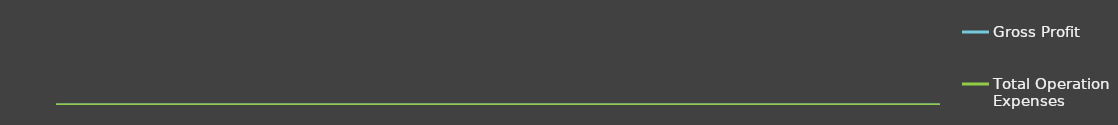
| Category | Gross Profit | Total Operation Expenses |
|---|---|---|
| 0 | 0 | 0 |
| 1 | 0 | 0 |
| 2 | 0 | 0 |
| 3 | 0 | 0 |
| 4 | 0 | 0 |
| 5 | 0 | 0 |
| 6 | 0 | 0 |
| 7 | 0 | 0 |
| 8 | 0 | 0 |
| 9 | 0 | 0 |
| 10 | 0 | 0 |
| 11 | 0 | 0 |